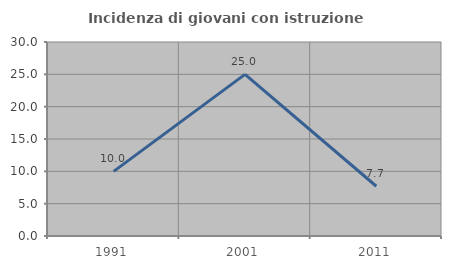
| Category | Incidenza di giovani con istruzione universitaria |
|---|---|
| 1991.0 | 10 |
| 2001.0 | 25 |
| 2011.0 | 7.692 |